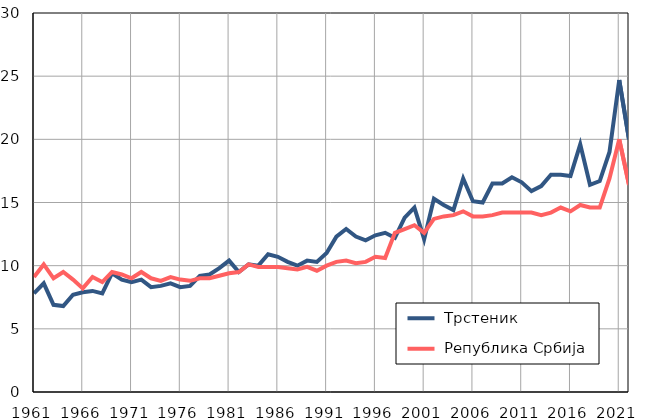
| Category |  Трстеник |  Република Србија |
|---|---|---|
| 1961.0 | 7.8 | 9.1 |
| 1962.0 | 8.6 | 10.1 |
| 1963.0 | 6.9 | 9 |
| 1964.0 | 6.8 | 9.5 |
| 1965.0 | 7.7 | 8.9 |
| 1966.0 | 7.9 | 8.2 |
| 1967.0 | 8 | 9.1 |
| 1968.0 | 7.8 | 8.7 |
| 1969.0 | 9.4 | 9.5 |
| 1970.0 | 8.9 | 9.3 |
| 1971.0 | 8.7 | 9 |
| 1972.0 | 8.9 | 9.5 |
| 1973.0 | 8.3 | 9 |
| 1974.0 | 8.4 | 8.8 |
| 1975.0 | 8.6 | 9.1 |
| 1976.0 | 8.3 | 8.9 |
| 1977.0 | 8.4 | 8.8 |
| 1978.0 | 9.2 | 9 |
| 1979.0 | 9.3 | 9 |
| 1980.0 | 9.8 | 9.2 |
| 1981.0 | 10.4 | 9.4 |
| 1982.0 | 9.5 | 9.5 |
| 1983.0 | 10.1 | 10.1 |
| 1984.0 | 10 | 9.9 |
| 1985.0 | 10.9 | 9.9 |
| 1986.0 | 10.7 | 9.9 |
| 1987.0 | 10.3 | 9.8 |
| 1988.0 | 10 | 9.7 |
| 1989.0 | 10.4 | 9.9 |
| 1990.0 | 10.3 | 9.6 |
| 1991.0 | 11 | 10 |
| 1992.0 | 12.3 | 10.3 |
| 1993.0 | 12.9 | 10.4 |
| 1994.0 | 12.3 | 10.2 |
| 1995.0 | 12 | 10.3 |
| 1996.0 | 12.4 | 10.7 |
| 1997.0 | 12.6 | 10.6 |
| 1998.0 | 12.2 | 12.6 |
| 1999.0 | 13.8 | 12.9 |
| 2000.0 | 14.6 | 13.2 |
| 2001.0 | 12.1 | 12.6 |
| 2002.0 | 15.3 | 13.7 |
| 2003.0 | 14.8 | 13.9 |
| 2004.0 | 14.4 | 14 |
| 2005.0 | 16.9 | 14.3 |
| 2006.0 | 15.1 | 13.9 |
| 2007.0 | 15 | 13.9 |
| 2008.0 | 16.5 | 14 |
| 2009.0 | 16.5 | 14.2 |
| 2010.0 | 17 | 14.2 |
| 2011.0 | 16.6 | 14.2 |
| 2012.0 | 15.9 | 14.2 |
| 2013.0 | 16.3 | 14 |
| 2014.0 | 17.2 | 14.2 |
| 2015.0 | 17.2 | 14.6 |
| 2016.0 | 17.1 | 14.3 |
| 2017.0 | 19.6 | 14.8 |
| 2018.0 | 16.4 | 14.6 |
| 2019.0 | 16.7 | 14.6 |
| 2020.0 | 19 | 16.9 |
| 2021.0 | 24.7 | 20 |
| 2022.0 | 20 | 16.4 |